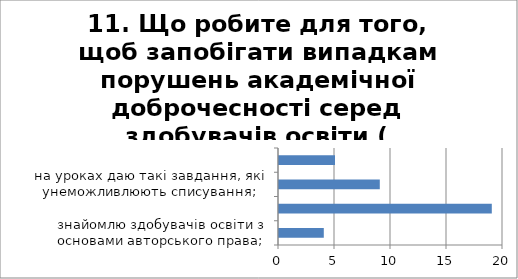
| Category | 11. Що робите для того, щоб запобігати випадкам порушень академічної доброчесності серед здобувачів освіти ( списування, плагіат, фальсифікація тощо)? |
|---|---|
| знайомлю здобувачів освіти з основами авторського права; | 4 |
| проводжу бесіди щодо дотримання академічної доброчесності; | 19 |
| на уроках даю такі завдання, які унеможливлюють списування; | 9 |
| використовую методичні розробки для формування основ академічної доброчесності | 5 |